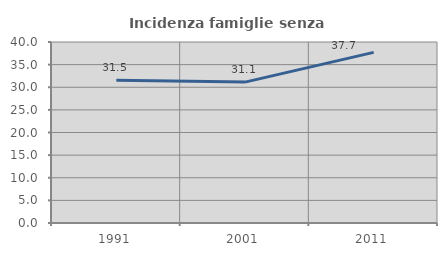
| Category | Incidenza famiglie senza nuclei |
|---|---|
| 1991.0 | 31.526 |
| 2001.0 | 31.133 |
| 2011.0 | 37.7 |